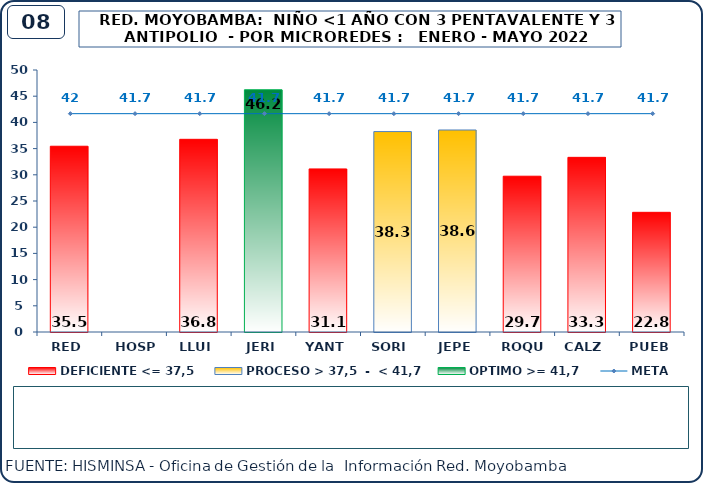
| Category | DEFICIENTE <= 37,5 | PROCESO > 37,5  -  < 41,7 | OPTIMO >= 41,7 |
|---|---|---|---|
| RED | 35.45 | 0 | 0 |
| HOSP | 0 | 0 | 0 |
| LLUI | 36.77 | 0 | 0 |
| JERI | 0 | 0 | 46.24 |
| YANT | 31.12 | 0 | 0 |
| SORI | 0 | 38.25 | 0 |
| JEPE | 0 | 38.55 | 0 |
| ROQU | 29.73 | 0 | 0 |
| CALZ | 33.33 | 0 | 0 |
| PUEB | 22.84 | 0 | 0 |